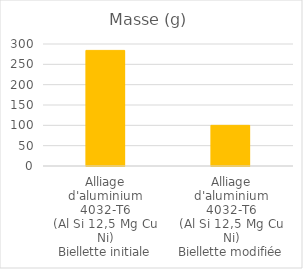
| Category | Series 0 |
|---|---|
| Alliage
d'aluminium
4032-T6
(Al Si 12,5 Mg Cu Ni)
Biellette initiale | 284.27 |
| Alliage
d'aluminium
4032-T6
(Al Si 12,5 Mg Cu Ni)
Biellette modifiée | 99.93 |